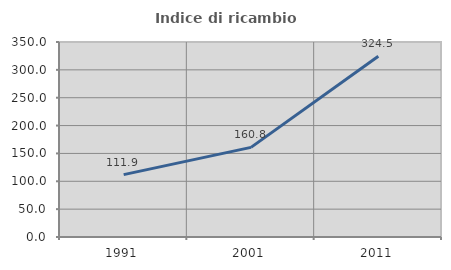
| Category | Indice di ricambio occupazionale  |
|---|---|
| 1991.0 | 111.95 |
| 2001.0 | 160.833 |
| 2011.0 | 324.468 |